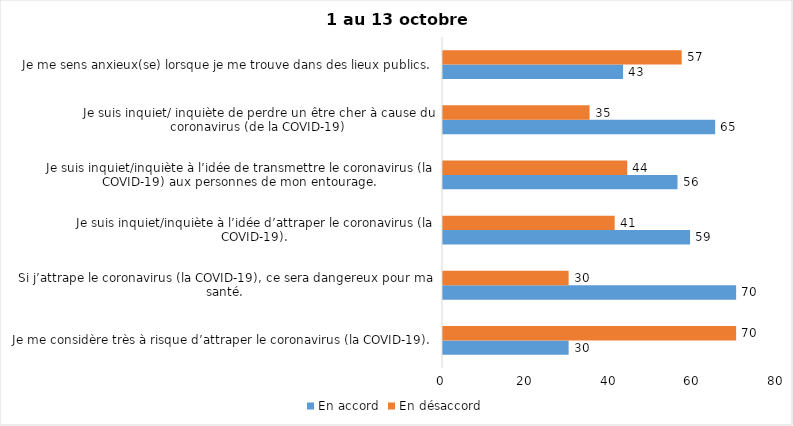
| Category | En accord | En désaccord |
|---|---|---|
| Je me considère très à risque d’attraper le coronavirus (la COVID-19). | 30 | 70 |
| Si j’attrape le coronavirus (la COVID-19), ce sera dangereux pour ma santé. | 70 | 30 |
| Je suis inquiet/inquiète à l’idée d’attraper le coronavirus (la COVID-19). | 59 | 41 |
| Je suis inquiet/inquiète à l’idée de transmettre le coronavirus (la COVID-19) aux personnes de mon entourage. | 56 | 44 |
| Je suis inquiet/ inquiète de perdre un être cher à cause du coronavirus (de la COVID-19) | 65 | 35 |
| Je me sens anxieux(se) lorsque je me trouve dans des lieux publics. | 43 | 57 |